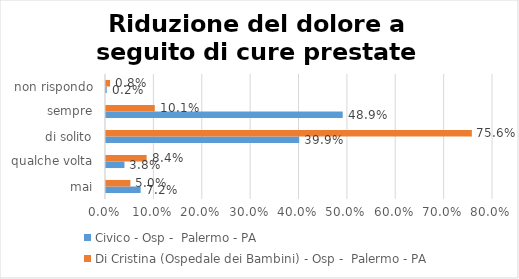
| Category | Civico - Osp -  Palermo - PA | Di Cristina (Ospedale dei Bambini) - Osp -  Palermo - PA |
|---|---|---|
| mai | 0.072 | 0.05 |
| qualche volta | 0.038 | 0.084 |
| di solito | 0.399 | 0.756 |
| sempre | 0.489 | 0.101 |
| non rispondo | 0.002 | 0.008 |